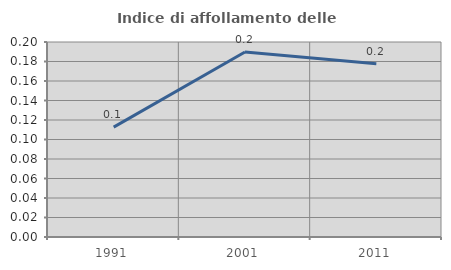
| Category | Indice di affollamento delle abitazioni  |
|---|---|
| 1991.0 | 0.113 |
| 2001.0 | 0.19 |
| 2011.0 | 0.178 |